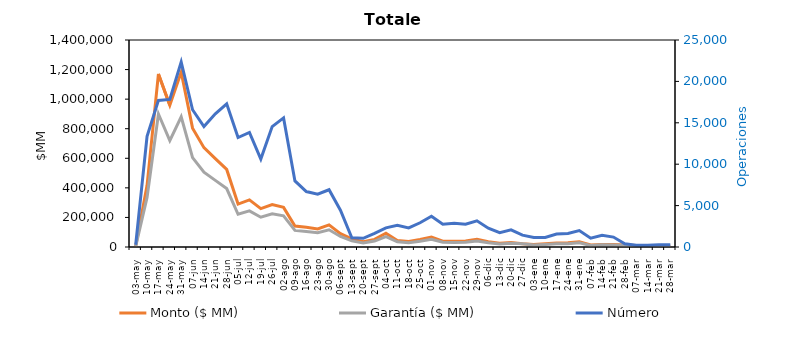
| Category | Monto ($ MM) | Garantía ($ MM) |
|---|---|---|
| 03-may | 5278.907 | 4130.348 |
| 10-may | 416971.583 | 335316.123 |
| 17-may | 1170549.305 | 899505.202 |
| 24-may | 958496.895 | 719981.288 |
| 31-may | 1182674.852 | 880758.799 |
| 07-jun | 803782.668 | 604895.58 |
| 14-jun | 671856.883 | 505442.809 |
| 21-jun | 597898.22 | 450525.961 |
| 28-jun | 524756.367 | 395269.169 |
| 05-jul | 290403.001 | 221263.684 |
| 12-jul | 318671.67 | 243987.897 |
| 19-jul | 259281.625 | 201374.794 |
| 26-jul | 286536.829 | 223970.221 |
| 02-ago | 268064.8 | 210945.057 |
| 09-ago | 142260.611 | 112336.784 |
| 16-ago | 134041.305 | 104494.608 |
| 23-ago | 122223.639 | 96715.145 |
| 30-ago | 150006.488 | 116314.955 |
| 06-sept | 89880.586 | 70898.452 |
| 13-sept | 54536.081 | 41251.682 |
| 20-sept | 36209.244 | 27925.536 |
| 27-sept | 51555.073 | 40136.027 |
| 04-oct | 93195.712 | 69935.719 |
| 11-oct | 43723.477 | 35209.071 |
| 18-oct | 37195.957 | 29582.161 |
| 25-oct | 50142.744 | 39598.618 |
| 01-nov | 66844.713 | 52220.664 |
| 08-nov | 39599.124 | 31681.859 |
| 15-nov | 38768.101 | 31032.193 |
| 22-nov | 40855.41 | 32166.41 |
| 29-nov | 51702.465 | 40784.669 |
| 06-dic | 35737.963 | 28687.215 |
| 13-dic | 25259.045 | 20680.933 |
| 20-dic | 30091.133 | 25675.319 |
| 27-dic | 21884.635 | 21167.884 |
| 03-ene | 16801.199 | 13567.354 |
| 10-ene | 22107.057 | 17533.169 |
| 17-ene | 26612.642 | 21375.919 |
| 24-ene | 28182.692 | 22688.529 |
| 31-ene | 35162.918 | 28155.228 |
| 07-feb | 13278.472 | 10995.962 |
| 14-feb | 17561.162 | 14520.323 |
| 21-feb | 16945.316 | 13623.349 |
| 28-feb | 12984.257 | 9998.125 |
| 07-mar | 9941.455 | 7471.231 |
| 14-mar | 9655.508 | 7364.138 |
| 21-mar | 6544.156 | 5210.978 |
| 28-mar | 5746.875 | 4565.165 |